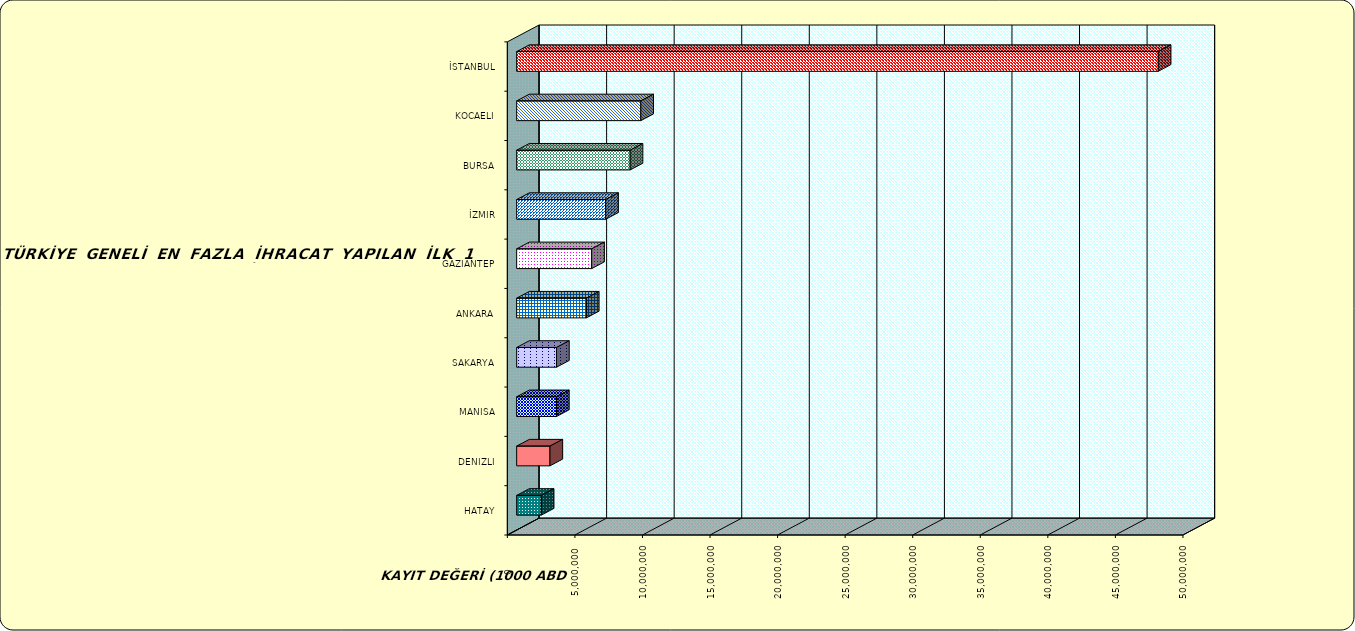
| Category | Series 0 |
|---|---|
| İSTANBUL | 47484035.53 |
| KOCAELI | 9190108.814 |
| BURSA | 8399949.046 |
| İZMIR | 6590576.01 |
| GAZIANTEP | 5554112.767 |
| ANKARA | 5160697.192 |
| SAKARYA | 2951786.517 |
| MANISA | 2945784.421 |
| DENIZLI | 2465183.037 |
| HATAY | 1822208.363 |